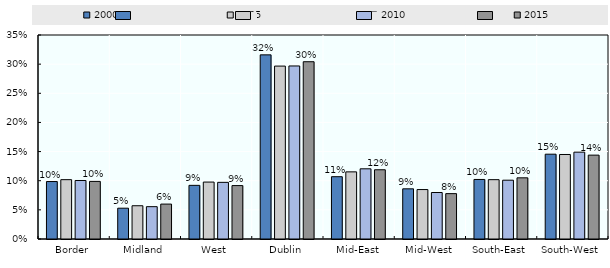
| Category | 2000 | 2005 | 2010 | 2015 |
|---|---|---|---|---|
| Border | 0.099 | 0.102 | 0.1 | 0.099 |
| Midland | 0.053 | 0.057 | 0.055 | 0.06 |
| West | 0.092 | 0.098 | 0.097 | 0.092 |
| Dublin | 0.316 | 0.297 | 0.297 | 0.304 |
| Mid-East | 0.107 | 0.115 | 0.12 | 0.119 |
| Mid-West | 0.086 | 0.085 | 0.08 | 0.078 |
| South-East | 0.102 | 0.102 | 0.101 | 0.105 |
| South-West | 0.145 | 0.145 | 0.149 | 0.144 |